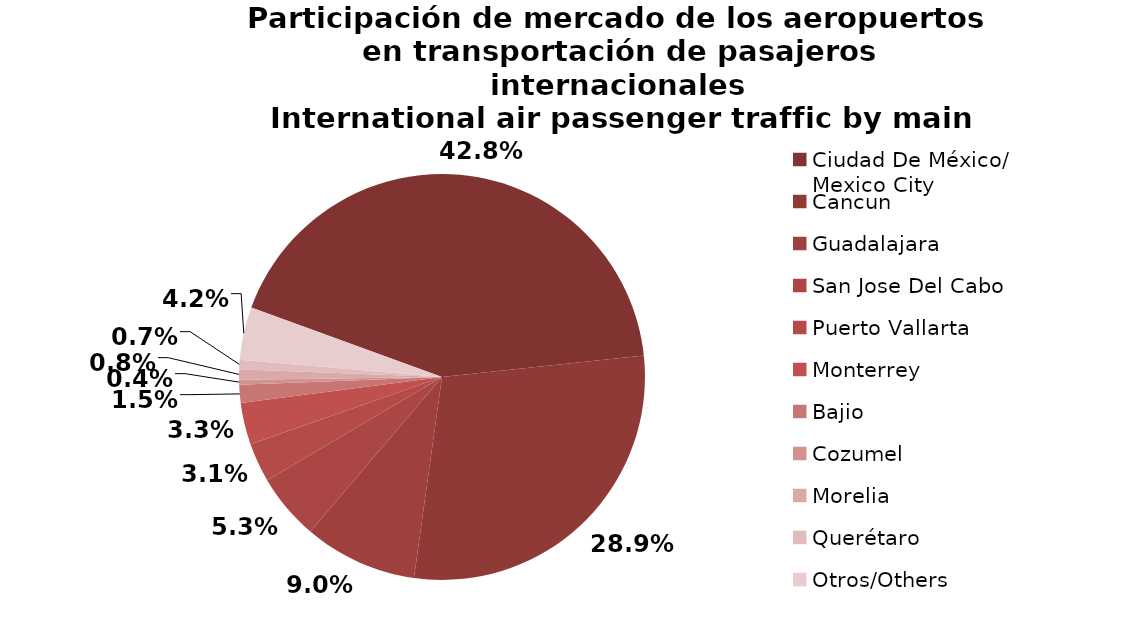
| Category | Series 0 |
|---|---|
| Ciudad De México/
Mexico City | 1330.829 |
| Cancun | 899.471 |
| Guadalajara | 280.889 |
| San Jose Del Cabo | 164.356 |
| Puerto Vallarta | 96.786 |
| Monterrey | 103.519 |
| Bajio | 45.246 |
| Cozumel | 12.217 |
| Morelia | 25.588 |
| Querétaro | 23.162 |
| Otros/Others | 130.641 |